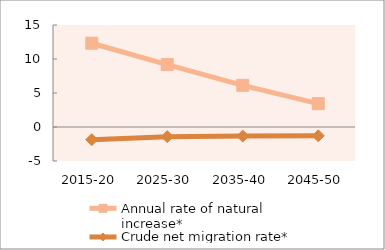
| Category | Annual rate of natural increase* | Crude net migration rate* |
|---|---|---|
| 2015-20 | 12.317 | -1.866 |
| 2025-30 | 9.179 | -1.419 |
| 2035-40 | 6.126 | -1.333 |
| 2045-50 | 3.432 | -1.288 |